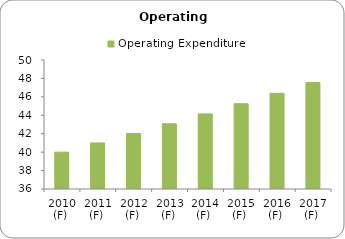
| Category | Operating Expenditure |
|---|---|
| 2010 (F)  | 40 |
| 2011 (F)  | 41 |
| 2012 (F)  | 42.025 |
| 2013 (F)  | 43.076 |
| 2014 (F)  | 44.153 |
| 2015 (F)  | 45.256 |
| 2016 (F)  | 46.388 |
| 2017 (F)  | 47.547 |